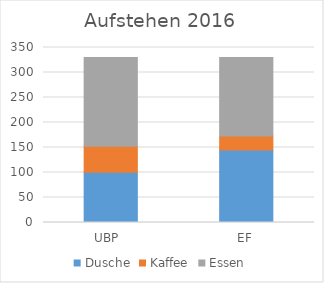
| Category | Dusche | Kaffee | Essen |
|---|---|---|---|
| UBP  | 100.391 | 51.869 | 177.74 |
| EF | 144.781 | 28.365 | 156.854 |